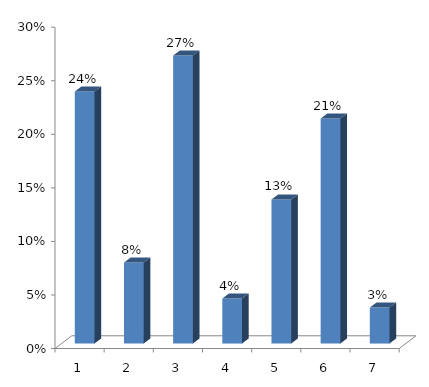
| Category | Series 0 |
|---|---|
| 0 | 0.235 |
| 1 | 0.076 |
| 2 | 0.269 |
| 3 | 0.042 |
| 4 | 0.134 |
| 5 | 0.21 |
| 6 | 0.034 |